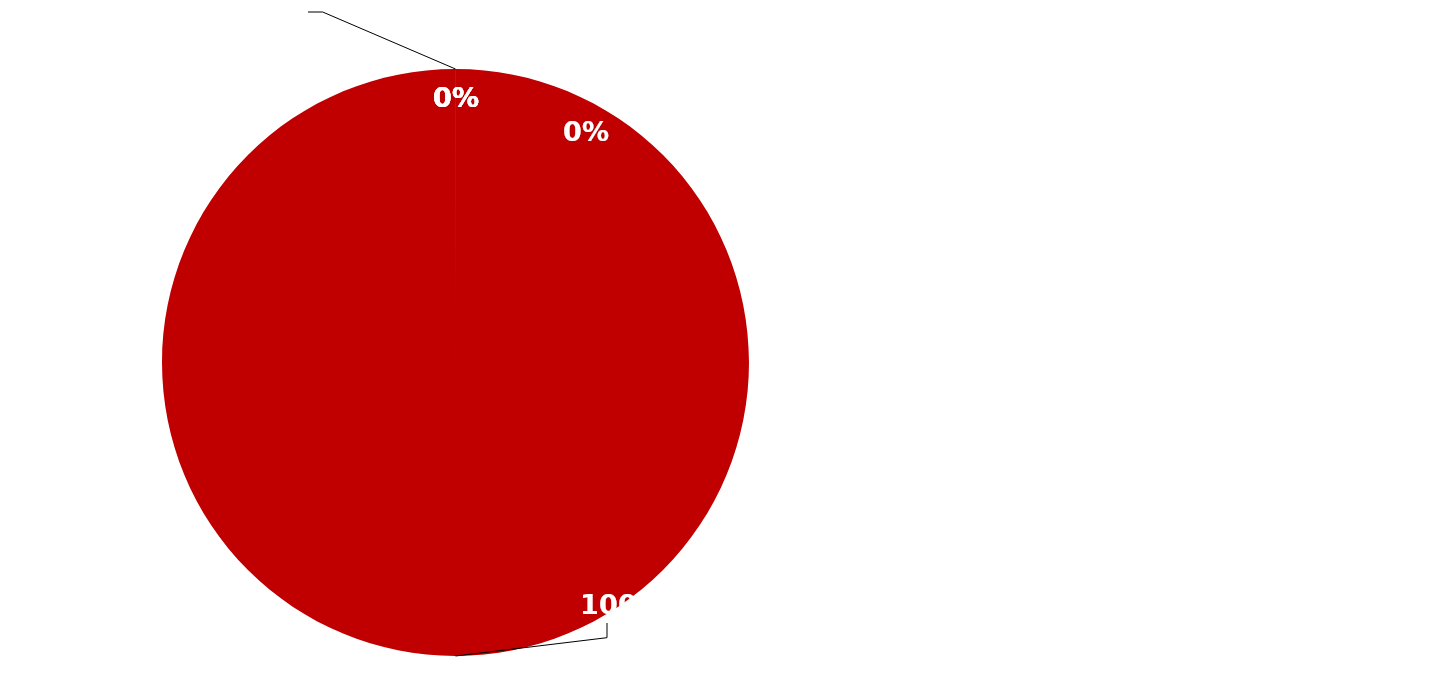
| Category | Series 0 |
|---|---|
| Salary (Includes 5 hours vacation and 5 hours sick leave) | 0 |
| Medical Insurance ($413 the state pays) | 413 |
| Retirement * (11.5% the state pays) | 0 |
| Social Security ** (6.2% the state pays) | 0 |
| Other *** (LTD, Basic Life, Medicare, Retiree Medical) | 0 |